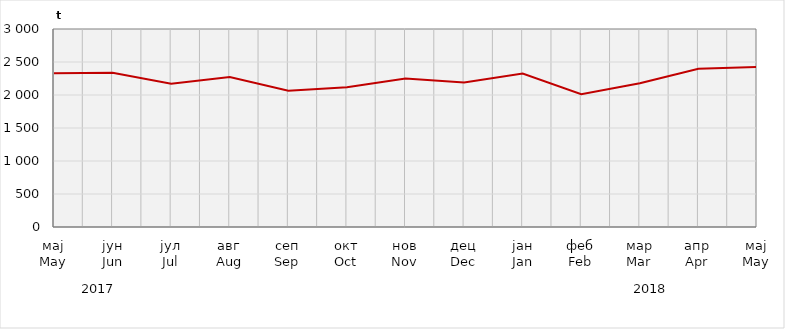
| Category | Нето тежина заклане стоке                              Net weight of  slaughtered livestock |
|---|---|
| мај
May | 2330965.85 |
| јун
Jun | 2337255.83 |
| јул
Jul | 2169976.6 |
| авг
Aug | 2273238.2 |
| сеп
Sep | 2066000 |
| окт
Oct | 2118775.52 |
| нов
Nov | 2248639.95 |
| дец
Dec | 2190874.83 |
| јан
Jan | 2324971.47 |
| феб
Feb | 2010400 |
| мар
Mar | 2177800 |
| апр
Apr | 2398200 |
| мај
May | 2425732.22 |